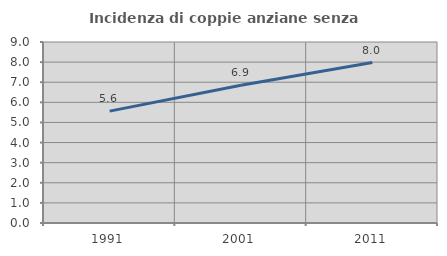
| Category | Incidenza di coppie anziane senza figli  |
|---|---|
| 1991.0 | 5.561 |
| 2001.0 | 6.852 |
| 2011.0 | 7.979 |